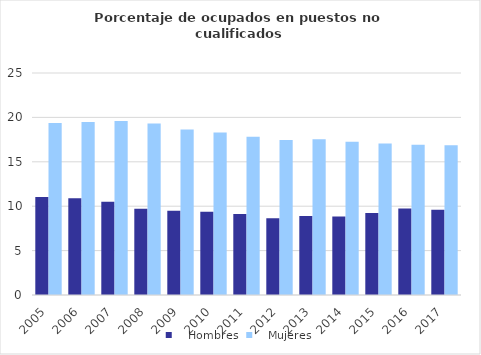
| Category |    Hombres |    Mujeres |
|---|---|---|
| 2005.0 | 11.036 | 19.361 |
| 2006.0 | 10.884 | 19.47 |
| 2007.0 | 10.488 | 19.593 |
| 2008.0 | 9.699 | 19.306 |
| 2009.0 | 9.502 | 18.644 |
| 2010.0 | 9.363 | 18.293 |
| 2011.0 | 9.125 | 17.832 |
| 2012.0 | 8.648 | 17.458 |
| 2013.0 | 8.885 | 17.544 |
| 2014.0 | 8.829 | 17.269 |
| 2015.0 | 9.225 | 17.048 |
| 2016.0 | 9.742 | 16.932 |
| 2017.0 | 9.606 | 16.856 |